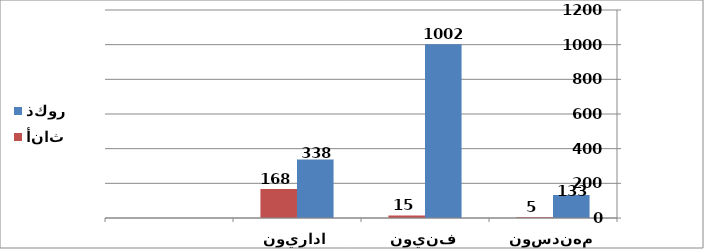
| Category | ذكور | أناث |
|---|---|---|
| مهندسون | 133 | 5 |
| فنيون | 1002 | 15 |
| اداريون | 338 | 168 |